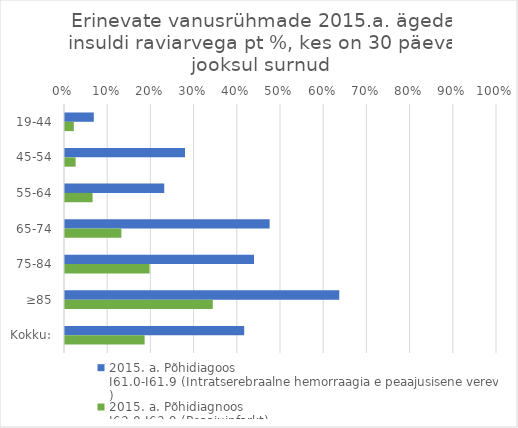
| Category | 2015. a. Põhidiagoos 
I61.0-I61.9 (Intratserebraalne hemorraagia e peaajusisene verevalum ) | 2015. a. Põhidiagnoos
I63.0-I63.9 (Peaajuinfarkt) |
|---|---|---|
| 19-44 | 0.067 | 0.02 |
| 45-54 | 0.278 | 0.025 |
| 55-64 | 0.23 | 0.064 |
| 65-74 | 0.474 | 0.13 |
| 75-84 | 0.438 | 0.196 |
| ≥85 | 0.635 | 0.342 |
| Kokku: | 0.415 | 0.184 |